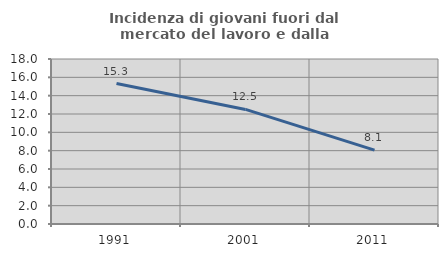
| Category | Incidenza di giovani fuori dal mercato del lavoro e dalla formazione  |
|---|---|
| 1991.0 | 15.325 |
| 2001.0 | 12.5 |
| 2011.0 | 8.065 |